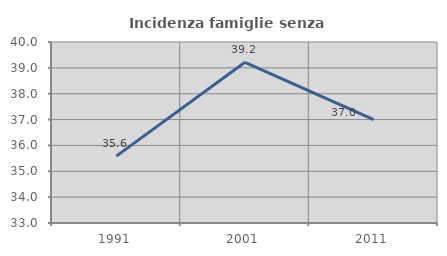
| Category | Incidenza famiglie senza nuclei |
|---|---|
| 1991.0 | 35.587 |
| 2001.0 | 39.213 |
| 2011.0 | 36.999 |